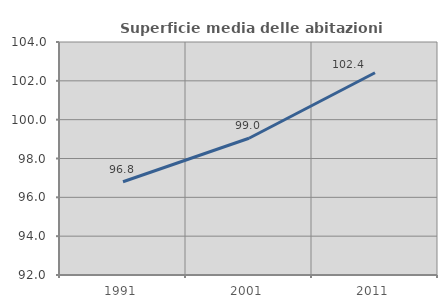
| Category | Superficie media delle abitazioni occupate |
|---|---|
| 1991.0 | 96.802 |
| 2001.0 | 99.042 |
| 2011.0 | 102.416 |